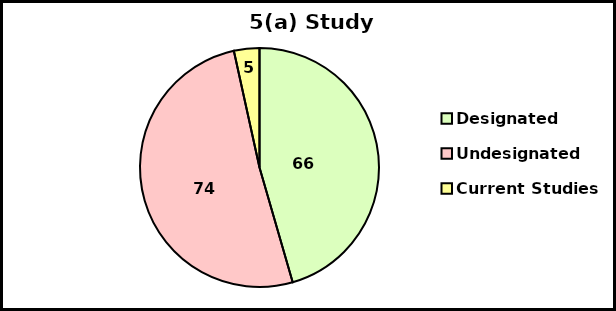
| Category | Series 0 |
|---|---|
| Designated  | 66 |
| Undesignated | 74 |
| Current Studies  | 5 |